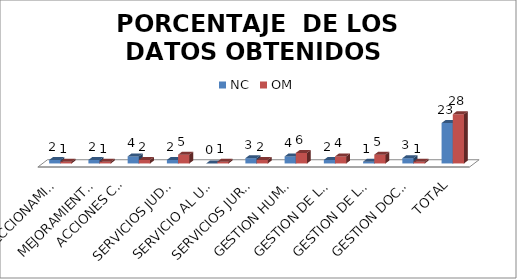
| Category | NC | OM |
|---|---|---|
| DIRECCIONAMIENTO DEL SGC | 2 | 1 |
| MEJORAMIENTO DE LA GESTION  | 2 | 1 |
| ACCIONES CONSTITUCIONALES
Y DISCIPLINARIAS | 4 | 2 |
| SERVICIOS JUDICIALES | 2 | 5 |
| SERVICIO AL USUARIO | 0 | 1 |
| SERVICIOS JURISPRUDENCIALES | 3 | 2 |
| GESTION HUMANA | 4 | 6 |
| GESTION DE LOS RECURSOS | 2 | 4 |
| GESTION DE LA INFORMACION | 1 | 5 |
| GESTION DOCUMENTAL | 3 | 1 |
| TOTAL | 23 | 28 |